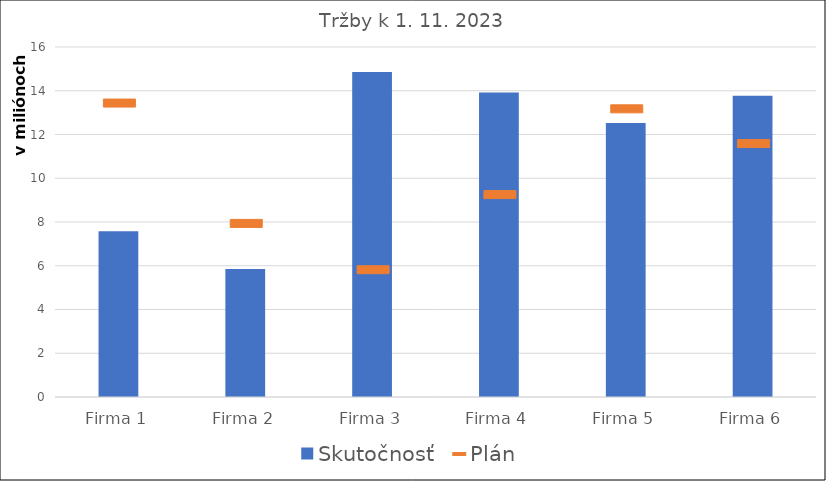
| Category | Skutočnosť |
|---|---|
| Firma 1 | 7572760.17 |
| Firma 2 | 5850762.763 |
| Firma 3 | 14852680.244 |
| Firma 4 | 13915309.052 |
| Firma 5 | 12522088.925 |
| Firma 6 | 13772848.004 |